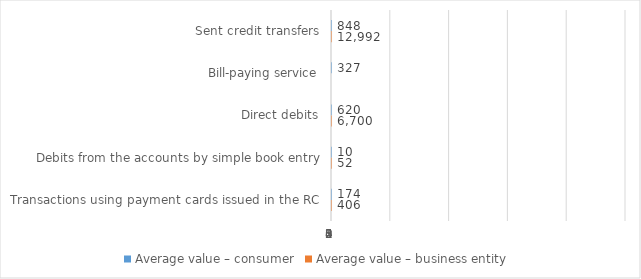
| Category | Average value – consumer | Average value – business entity  |
|---|---|---|
| Sent credit transfers | 848.042 | 12992.371 |
| Bill-paying service | 326.913 | 0 |
| Direct debits | 620.066 | 6700.498 |
| Debits from the accounts by simple book entry | 9.648 | 51.833 |
| Transactions using payment cards issued in the RC | 174.154 | 406.26 |